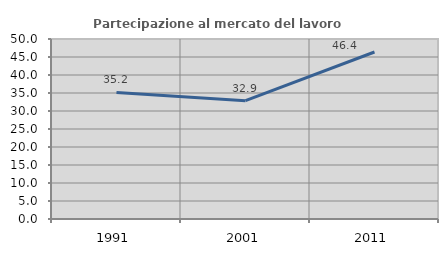
| Category | Partecipazione al mercato del lavoro  femminile |
|---|---|
| 1991.0 | 35.171 |
| 2001.0 | 32.879 |
| 2011.0 | 46.388 |